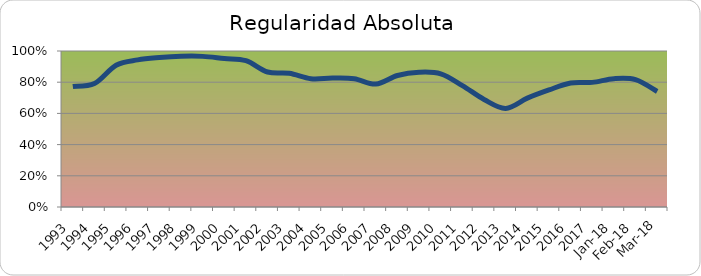
| Category | Series 0 |
|---|---|
| 1993.0 | 0.773 |
| 1994.0 | 0.791 |
| 1995.0 | 0.909 |
| 1996.0 | 0.943 |
| 1997.0 | 0.958 |
| 1998.0 | 0.966 |
| 1999.0 | 0.966 |
| 2000.0 | 0.952 |
| 2001.0 | 0.938 |
| 2002.0 | 0.865 |
| 2003.0 | 0.857 |
| 2004.0 | 0.822 |
| 2005.0 | 0.827 |
| 2006.0 | 0.822 |
| 2007.0 | 0.788 |
| 2008.0 | 0.843 |
| 2009.0 | 0.864 |
| 2010.0 | 0.854 |
| 2011.0 | 0.779 |
| 2012.0 | 0.69 |
| 2013.0 | 0.632 |
| 2014.0 | 0.698 |
| 2015.0 | 0.75 |
| 2016.0 | 0.795 |
| 2017.0 | 0.799 |
| 43101.0 | 0.823 |
| 43132.0 | 0.816 |
| 43160.0 | 0.741 |